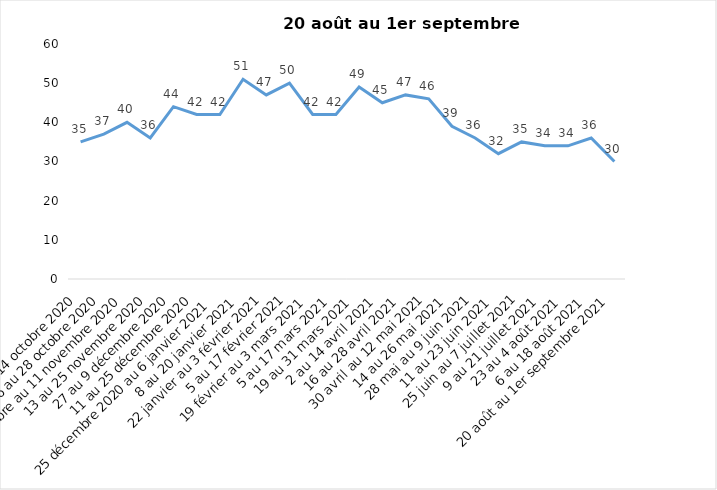
| Category | Toujours aux trois mesures |
|---|---|
| 2 au 14 octobre 2020 | 35 |
| 16 au 28 octobre 2020 | 37 |
| 30 octobre au 11 novembre 2020 | 40 |
| 13 au 25 novembre 2020 | 36 |
| 27 au 9 décembre 2020 | 44 |
| 11 au 25 décembre 2020 | 42 |
| 25 décembre 2020 au 6 janvier 2021 | 42 |
| 8 au 20 janvier 2021 | 51 |
| 22 janvier au 3 février 2021 | 47 |
| 5 au 17 février 2021 | 50 |
| 19 février au 3 mars 2021 | 42 |
| 5 au 17 mars 2021 | 42 |
| 19 au 31 mars 2021 | 49 |
| 2 au 14 avril 2021 | 45 |
| 16 au 28 avril 2021 | 47 |
| 30 avril au 12 mai 2021 | 46 |
| 14 au 26 mai 2021 | 39 |
| 28 mai au 9 juin 2021 | 36 |
| 11 au 23 juin 2021 | 32 |
| 25 juin au 7 juillet 2021 | 35 |
| 9 au 21 juillet 2021 | 34 |
| 23 au 4 août 2021 | 34 |
| 6 au 18 août 2021 | 36 |
| 20 août au 1er septembre 2021 | 30 |